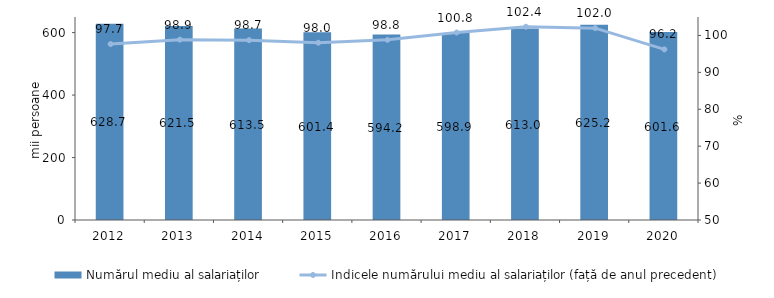
| Category | Numărul mediu al salariaților |
|---|---|
| 2012.0 | 628.695 |
| 2013.0 | 621.518 |
| 2014.0 | 613.526 |
| 2015.0 | 601.4 |
| 2016.0 | 594.219 |
| 2017.0 | 598.947 |
| 2018.0 | 613.048 |
| 2019.0 | 625.203 |
| 2020.0 | 601.597 |